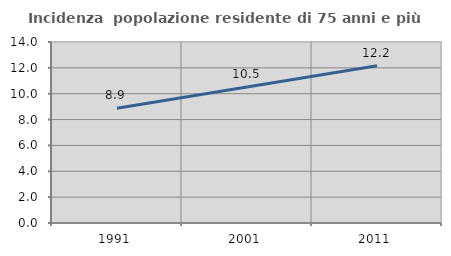
| Category | Incidenza  popolazione residente di 75 anni e più |
|---|---|
| 1991.0 | 8.875 |
| 2001.0 | 10.521 |
| 2011.0 | 12.167 |